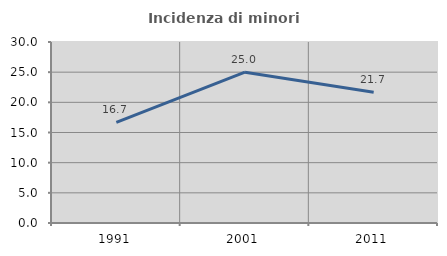
| Category | Incidenza di minori stranieri |
|---|---|
| 1991.0 | 16.667 |
| 2001.0 | 25 |
| 2011.0 | 21.667 |